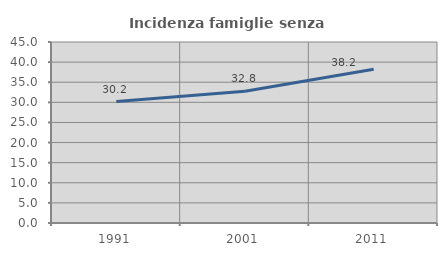
| Category | Incidenza famiglie senza nuclei |
|---|---|
| 1991.0 | 30.185 |
| 2001.0 | 32.751 |
| 2011.0 | 38.228 |